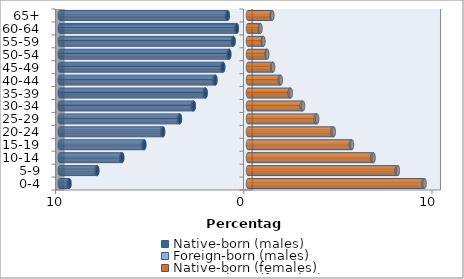
| Category | Native-born (males) | Foreign-born (males) | Native-born (females) | Foreign-born (females) |
|---|---|---|---|---|
| 0-4 | -9.487 | -0.059 | 9.324 | 0.061 |
| 5-9 | -8.007 | -0.053 | 7.904 | 0.057 |
| 10-14 | -6.684 | -0.052 | 6.615 | 0.058 |
| 15-19 | -5.51 | -0.051 | 5.467 | 0.06 |
| 20-24 | -4.511 | -0.053 | 4.491 | 0.067 |
| 25-29 | -3.616 | -0.057 | 3.602 | 0.073 |
| 30-34 | -2.882 | -0.057 | 2.857 | 0.069 |
| 35-39 | -2.252 | -0.056 | 2.216 | 0.06 |
| 40-44 | -1.733 | -0.052 | 1.693 | 0.05 |
| 45-49 | -1.32 | -0.047 | 1.293 | 0.041 |
| 50-54 | -0.995 | -0.042 | 0.993 | 0.034 |
| 55-59 | -0.769 | -0.036 | 0.793 | 0.028 |
| 60-64 | -0.592 | -0.036 | 0.636 | 0.028 |
| 65+ | -1.079 | -0.045 | 1.263 | 0.033 |